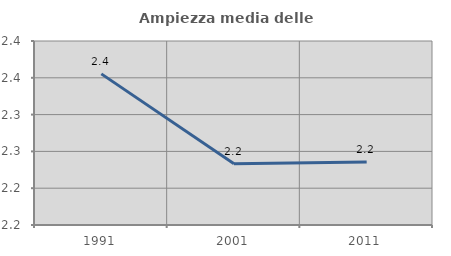
| Category | Ampiezza media delle famiglie |
|---|---|
| 1991.0 | 2.355 |
| 2001.0 | 2.233 |
| 2011.0 | 2.236 |